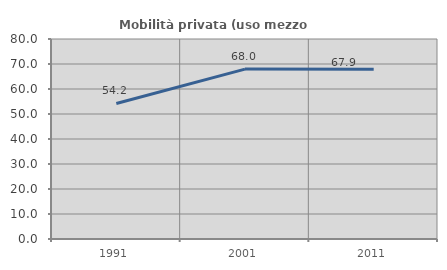
| Category | Mobilità privata (uso mezzo privato) |
|---|---|
| 1991.0 | 54.229 |
| 2001.0 | 67.954 |
| 2011.0 | 67.914 |